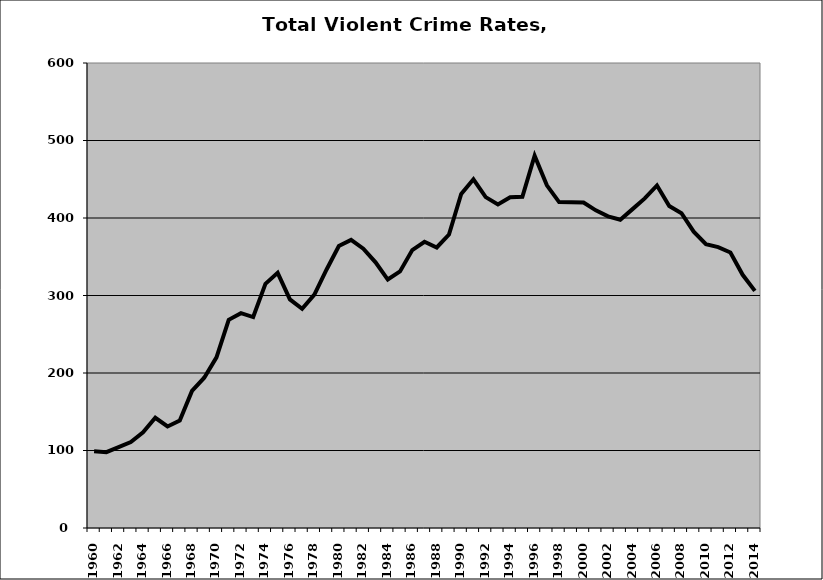
| Category | VCR |
|---|---|
| 1960.0 | 98.972 |
| 1961.0 | 97.864 |
| 1962.0 | 104.219 |
| 1963.0 | 110.977 |
| 1964.0 | 123.588 |
| 1965.0 | 142.222 |
| 1966.0 | 130.97 |
| 1967.0 | 138.61 |
| 1968.0 | 176.827 |
| 1969.0 | 193.908 |
| 1970.0 | 220.198 |
| 1971.0 | 268.684 |
| 1972.0 | 277.142 |
| 1973.0 | 272.198 |
| 1974.0 | 315.006 |
| 1975.0 | 329.187 |
| 1976.0 | 294.933 |
| 1977.0 | 282.8 |
| 1978.0 | 301.115 |
| 1979.0 | 333.586 |
| 1980.0 | 363.931 |
| 1981.0 | 371.746 |
| 1982.0 | 360.447 |
| 1983.0 | 342.85 |
| 1984.0 | 320.595 |
| 1985.0 | 331.055 |
| 1986.0 | 358.558 |
| 1987.0 | 369.362 |
| 1988.0 | 361.969 |
| 1989.0 | 378.621 |
| 1990.0 | 431.026 |
| 1991.0 | 449.996 |
| 1992.0 | 426.98 |
| 1993.0 | 417.455 |
| 1994.0 | 426.693 |
| 1995.0 | 427.319 |
| 1996.0 | 480.3 |
| 1997.0 | 442.097 |
| 1998.0 | 420.548 |
| 1999.0 | 420.468 |
| 2000.0 | 420.029 |
| 2001.0 | 409.913 |
| 2002.0 | 402.131 |
| 2003.0 | 397.793 |
| 2004.0 | 411.458 |
| 2005.0 | 425.309 |
| 2006.0 | 442.02 |
| 2007.0 | 415.538 |
| 2008.0 | 406.243 |
| 2009.0 | 382.3 |
| 2010.0 | 366.183 |
| 2011.0 | 362.439 |
| 2012.0 | 355.549 |
| 2013.0 | 326.712 |
| 2014.0 | 305.962 |